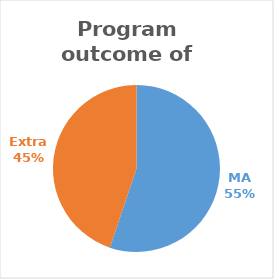
| Category | Series 0 |
|---|---|
| MA | 16 |
| Extra | 13 |